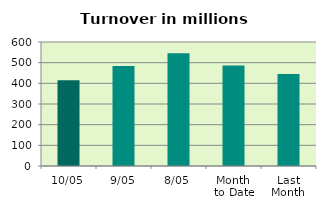
| Category | Series 0 |
|---|---|
| 10/05 | 414.808 |
| 9/05 | 484.108 |
| 8/05 | 545.129 |
| Month 
to Date | 486.714 |
| Last
Month | 444.663 |